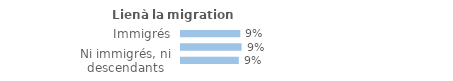
| Category | Series 0 |
|---|---|
| Immigrés | 0.088 |
| Descendants d'immigré(s) | 0.09 |
| Ni immigrés, ni descendants | 0.086 |